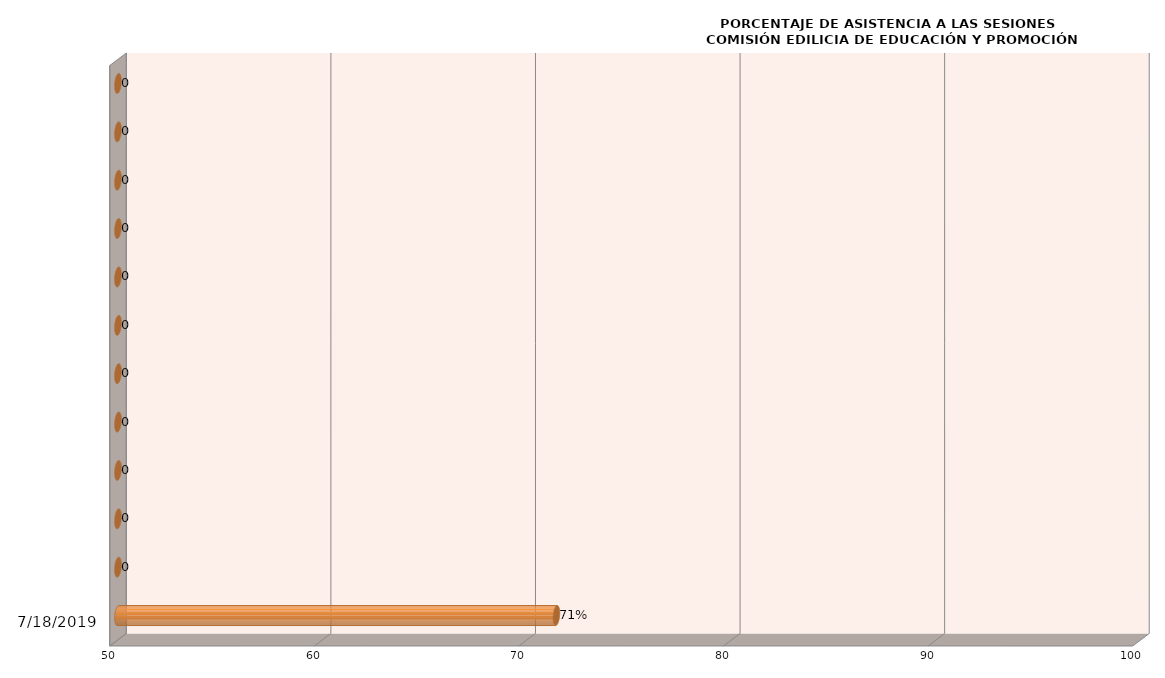
| Category | Series 0 |
|---|---|
| 7/18/19 | 71.429 |
| nan | 0 |
| nan | 0 |
| nan | 0 |
| nan | 0 |
| nan | 0 |
| nan | 0 |
| nan | 0 |
| nan | 0 |
| nan | 0 |
| nan | 0 |
| nan | 0 |